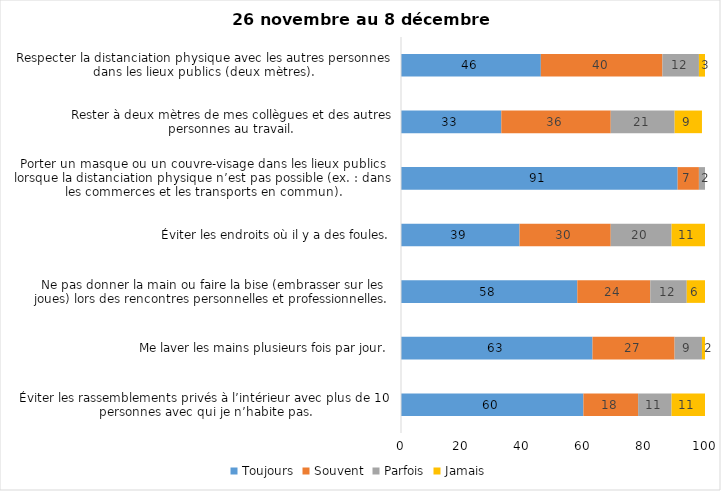
| Category | Toujours | Souvent | Parfois | Jamais |
|---|---|---|---|---|
| Éviter les rassemblements privés à l’intérieur avec plus de 10 personnes avec qui je n’habite pas. | 60 | 18 | 11 | 11 |
| Me laver les mains plusieurs fois par jour. | 63 | 27 | 9 | 2 |
| Ne pas donner la main ou faire la bise (embrasser sur les joues) lors des rencontres personnelles et professionnelles. | 58 | 24 | 12 | 6 |
| Éviter les endroits où il y a des foules. | 39 | 30 | 20 | 11 |
| Porter un masque ou un couvre-visage dans les lieux publics lorsque la distanciation physique n’est pas possible (ex. : dans les commerces et les transports en commun). | 91 | 7 | 2 | 0 |
| Rester à deux mètres de mes collègues et des autres personnes au travail. | 33 | 36 | 21 | 9 |
| Respecter la distanciation physique avec les autres personnes dans les lieux publics (deux mètres). | 46 | 40 | 12 | 3 |